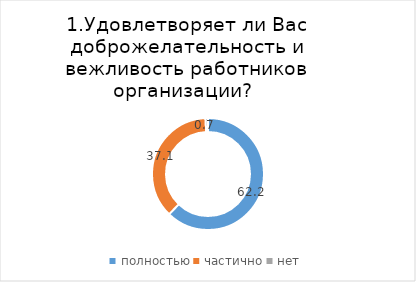
| Category | Шагарский |
|---|---|
| полностью | 62.238 |
| частично | 37.063 |
| нет | 0.699 |